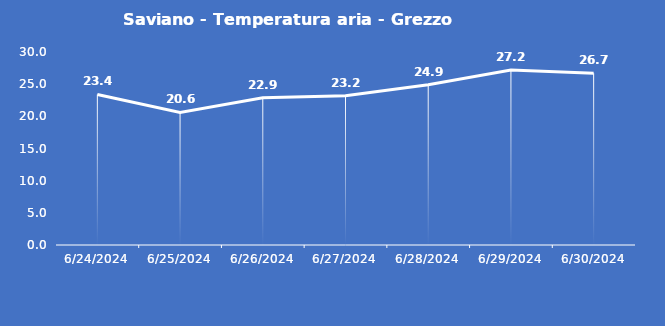
| Category | Saviano - Temperatura aria - Grezzo (°C) |
|---|---|
| 6/24/24 | 23.4 |
| 6/25/24 | 20.6 |
| 6/26/24 | 22.9 |
| 6/27/24 | 23.2 |
| 6/28/24 | 24.9 |
| 6/29/24 | 27.2 |
| 6/30/24 | 26.7 |